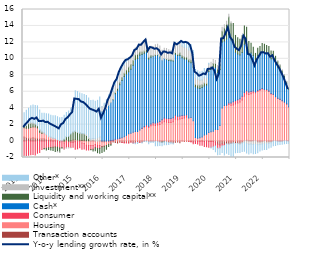
| Category | Transaction accounts | Housing | Consumer | Cash* | Liquidity and working capital** | Investment** | Other* |
|---|---|---|---|---|---|---|---|
| 2013-01-01 | 0.492 | 1.111 | -1.776 | 0 | 0.228 | -0.026 | 1.61 |
| 2013-02-01 | 0.439 | 1.127 | -1.758 | 0 | 0.325 | 0.055 | 1.802 |
| 2013-03-01 | 0.384 | 1.163 | -1.741 | 0 | 0.545 | 0.165 | 1.739 |
| 2013-04-01 | 0.352 | 1.289 | -1.665 | 0 | 0.493 | 0.147 | 1.999 |
| 2013-05-01 | 0.415 | 1.308 | -1.636 | 0 | 0.394 | 0.108 | 2.173 |
| 2013-06-01 | 0.343 | 1.366 | -1.699 | 0 | 0.33 | 0.062 | 2.234 |
| 2013-07-01 | 0.366 | 1.236 | -1.48 | 0 | 0.258 | 0.044 | 2.377 |
| 2013-08-01 | 0.269 | 0.793 | -1.401 | 0 | 0.249 | 0.096 | 2.37 |
| 2013-09-01 | 0.275 | 0.649 | -1.02 | 0 | 0.155 | 0.104 | 2.206 |
| 2013-10-01 | 0.288 | 0.658 | -0.915 | 0 | -0.041 | 0.071 | 2.362 |
| 2013-11-01 | 0.228 | 0.543 | -0.865 | 0 | -0.219 | 0.056 | 2.504 |
| 2013-12-01 | 0.173 | 0.348 | -0.812 | 0 | -0.202 | 0.099 | 2.679 |
| 2014-01-01 | 0.157 | 0.254 | -0.797 | 0 | -0.28 | 0.097 | 2.635 |
| 2014-02-01 | 0.046 | 0.245 | -0.762 | 0 | -0.373 | 0.085 | 2.693 |
| 2014-03-01 | 0.09 | 0.216 | -0.715 | 0 | -0.554 | 0.005 | 2.756 |
| 2014-04-01 | 0.083 | 0.103 | -0.741 | 0 | -0.539 | -0.021 | 2.769 |
| 2014-05-01 | -0.101 | 0.074 | -0.749 | 0 | -0.489 | -0.025 | 2.775 |
| 2014-06-01 | 0.019 | -0.042 | -0.742 | 0 | -0.097 | -0.013 | 2.845 |
| 2014-07-01 | -0.097 | -0.133 | -0.742 | 0 | 0.233 | -0.038 | 2.909 |
| 2014-08-01 | -0.096 | 0.125 | -0.721 | 0 | 0.406 | -0.038 | 2.94 |
| 2014-09-01 | -0.079 | 0.01 | -0.703 | 0 | 0.582 | -0.06 | 3.072 |
| 2014-10-01 | -0.145 | 0.049 | -0.645 | 0 | 0.801 | -0.027 | 3.138 |
| 2014-11-01 | -0.136 | 0.135 | -0.613 | 0 | 0.927 | 0.032 | 3.103 |
| 2014-12-01 | -0.093 | 0.165 | -0.899 | 0 | 1.027 | 0.018 | 4.9 |
| 2015-01-01 | -0.101 | 0.127 | -0.85 | 0 | 0.953 | 0.027 | 4.917 |
| 2015-02-01 | 0.048 | 0.049 | -0.809 | 0 | 0.87 | 0.009 | 4.873 |
| 2015-03-01 | 0.077 | -0.228 | -0.764 | 0 | 0.805 | 0.041 | 4.823 |
| 2015-04-01 | 0.094 | -0.3 | -0.676 | 0 | 0.722 | 0.107 | 4.729 |
| 2015-05-01 | 0.036 | -0.497 | -0.601 | 0 | 0.653 | 0.15 | 4.713 |
| 2015-06-01 | 0.047 | -0.529 | -0.544 | 0 | 0.27 | 0.209 | 4.71 |
| 2015-07-01 | 0.01 | -0.526 | -0.494 | 0 | -0.027 | 0.249 | 4.661 |
| 2015-08-01 | 0.058 | -0.546 | -0.455 | 0 | -0.197 | 0.245 | 4.67 |
| 2015-09-01 | -0.026 | -0.398 | -0.4 | 0 | -0.348 | 0.31 | 4.533 |
| 2015-10-01 | -0.033 | -0.489 | -0.371 | 0 | -0.523 | 0.396 | 4.552 |
| 2015-11-01 | 0.007 | -0.534 | -0.343 | 0 | -0.612 | 0.475 | 4.866 |
| 2015-12-01 | -0.087 | -0.586 | -0.019 | 3.553 | -0.71 | 0.612 | 0.012 |
| 2016-01-01 | -0.124 | -0.493 | -0.015 | 3.681 | -0.603 | 0.661 | 0.247 |
| 2016-02-01 | -0.042 | -0.508 | 0.006 | 3.928 | -0.452 | 0.725 | 0.36 |
| 2016-03-01 | -0.149 | -0.229 | 0.045 | 4.286 | -0.298 | 0.871 | 0.42 |
| 2016-04-01 | -0.285 | -0.1 | 0.053 | 4.618 | -0.122 | 0.89 | 0.421 |
| 2016-05-01 | -0.106 | 0.028 | 0.062 | 4.946 | 0.026 | 0.927 | 0.414 |
| 2016-06-01 | -0.172 | 0.16 | 0.059 | 5.547 | 0.131 | 0.935 | 0.426 |
| 2016-07-01 | -0.251 | 0.241 | 0.034 | 5.91 | 0.23 | 0.921 | 0.395 |
| 2016-08-01 | -0.151 | 0.345 | 0.008 | 6.5 | 0.297 | 0.931 | 0.417 |
| 2016-09-01 | -0.175 | 0.406 | -0.015 | 6.972 | 0.338 | 1.003 | 0.388 |
| 2016-10-01 | -0.173 | 0.538 | -0.05 | 7.327 | 0.384 | 0.98 | 0.406 |
| 2016-11-01 | -0.171 | 0.696 | -0.06 | 7.474 | 0.486 | 0.944 | 0.426 |
| 2016-12-01 | -0.197 | 0.873 | -0.04 | 7.552 | 0.582 | 0.863 | 0.252 |
| 2017-01-01 | -0.104 | 0.959 | -0.02 | 7.784 | 0.581 | 0.848 | 0.045 |
| 2017-02-01 | -0.204 | 1.081 | -0.026 | 8.139 | 0.571 | 0.839 | -0.036 |
| 2017-03-01 | -0.204 | 1.159 | -0.038 | 8.749 | 0.574 | 0.871 | -0.092 |
| 2017-04-01 | -0.15 | 1.157 | -0.034 | 8.89 | 0.496 | 0.901 | -0.106 |
| 2017-05-01 | -0.136 | 1.349 | -0.007 | 9.092 | 0.39 | 0.953 | 0.027 |
| 2017-06-01 | -0.147 | 1.539 | 0.027 | 8.949 | 0.32 | 1.052 | -0.078 |
| 2017-07-01 | -0.013 | 1.668 | 0.095 | 8.902 | 0.277 | 1.122 | -0.053 |
| 2017-08-01 | -0.025 | 1.767 | 0.186 | 8.894 | 0.31 | 1.206 | -0.055 |
| 2017-09-01 | -0.094 | 1.647 | 0.143 | 8.192 | 0.201 | 1.092 | -0.235 |
| 2017-10-01 | -0.014 | 1.85 | 0.235 | 8.093 | 0.233 | 1.132 | -0.151 |
| 2017-11-01 | -0.023 | 1.939 | 0.299 | 8.08 | 0.04 | 1.128 | -0.15 |
| 2017-12-01 | -0.055 | 1.895 | 0.307 | 8.215 | 0.084 | 1.227 | -0.507 |
| 2018-01-01 | -0.08 | 1.954 | 0.323 | 8.187 | 0.077 | 1.244 | -0.481 |
| 2018-02-01 | -0.112 | 2.022 | 0.364 | 7.858 | 0.041 | 1.267 | -0.424 |
| 2018-03-01 | -0.109 | 2.181 | 0.41 | 7.241 | -0.039 | 1.218 | -0.434 |
| 2018-04-01 | -0.08 | 2.337 | 0.457 | 7.237 | -0.009 | 1.25 | -0.36 |
| 2018-05-01 | -0.114 | 2.292 | 0.485 | 7.16 | 0.07 | 1.248 | -0.331 |
| 2018-06-01 | -0.164 | 2.242 | 0.499 | 7.054 | 0.135 | 1.17 | -0.265 |
| 2018-07-01 | -0.143 | 2.256 | 0.489 | 7.02 | 0.116 | 1.173 | -0.183 |
| 2018-08-01 | -0.223 | 2.357 | 0.468 | 6.916 | 0.085 | 1.152 | -0.143 |
| 2018-09-01 | -0.139 | 2.658 | 0.492 | 7.41 | 0.196 | 1.199 | 0.065 |
| 2018-10-01 | -0.124 | 2.593 | 0.436 | 7.379 | 0.15 | 1.167 | 0.099 |
| 2018-11-01 | -0.204 | 2.68 | 0.38 | 7.342 | 0.298 | 1.219 | 0.158 |
| 2018-12-01 | -0.005 | 2.736 | 0.362 | 7.027 | 0.25 | 1.199 | 0.551 |
| 2019-01-01 | -0.044 | 2.807 | 0.339 | 6.833 | 0.26 | 1.161 | 0.586 |
| 2019-02-01 | -0.024 | 2.911 | 0.28 | 6.76 | 0.267 | 1.154 | 0.65 |
| 2019-03-01 | -0.041 | 2.81 | -0.018 | 6.848 | 0.276 | 1.125 | 0.899 |
| 2019-04-01 | -0.041 | 2.851 | -0.072 | 6.67 | 0.344 | 0.939 | 0.934 |
| 2019-05-01 | -0.1 | 2.468 | -0.228 | 6.479 | 0.327 | 0.833 | 0.908 |
| 2019-06-01 | -0.031 | 0.418 | -0.277 | 6.176 | 0.319 | 0.797 | 0.985 |
| 2019-07-01 | -0.025 | 0.329 | -0.339 | 6.12 | 0.361 | 0.703 | 1.051 |
| 2019-08-01 | -0.025 | 0.403 | -0.498 | 5.998 | 0.374 | 0.626 | 1.011 |
| 2019-09-01 | 0.002 | 0.505 | -0.508 | 6.006 | 0.326 | 0.599 | 1.06 |
| 2019-10-01 | -0.05 | 0.732 | -0.599 | 5.959 | 0.37 | 0.626 | 1.125 |
| 2019-11-01 | 0.007 | 0.833 | -0.705 | 5.97 | 0.215 | 0.673 | 1.082 |
| 2019-12-01 | -0.045 | 1.054 | -0.703 | 7.412 | 0.299 | 0.593 | 0.108 |
| 2020-01-31 | -0.066 | 1.137 | -0.68 | 7.552 | 0.352 | 0.533 | -0.107 |
| 2020-02-29 | -0.05 | 1.19 | -0.645 | 7.832 | 0.424 | 0.471 | -0.342 |
| 2020-03-31 | -0.142 | 1.412 | -0.468 | 7.55 | 0.49 | 0.355 | -0.69 |
| 2020-04-30 | -0.389 | 1.394 | -0.481 | 6.938 | 0.422 | 0.421 | -0.803 |
| 2020-05-31 | -0.495 | 1.906 | -0.315 | 6.799 | 0.629 | 0.444 | -0.833 |
| 2020-06-30 | -0.37 | 4.031 | -0.214 | 8.026 | 1.3 | 0.469 | -0.818 |
| 2020-07-31 | -0.414 | 4.316 | -0.138 | 7.868 | 1.575 | 0.386 | -1.15 |
| 2020-08-31 | -0.351 | 4.33 | 0.051 | 8.037 | 1.786 | 0.363 | -1.144 |
| 2020-09-30 | -0.365 | 4.448 | 0.173 | 8.326 | 2.142 | 0.325 | -1.281 |
| 2020-10-31 | -0.294 | 4.368 | 0.267 | 7.647 | 2.039 | 0.188 | -1.635 |
| 2020-11-30 | -0.236 | 4.392 | 0.386 | 7.401 | 2.127 | -0.011 | -1.82 |
| 2020-12-31 | -0.302 | 4.507 | 0.414 | 5.891 | 2.034 | -0.043 | -1.082 |
| 2021-01-31 | -0.282 | 4.635 | 0.397 | 5.556 | 1.97 | -0.052 | -1.049 |
| 2021-02-28 | -0.276 | 4.761 | 0.394 | 5.304 | 1.925 | -0.108 | -0.997 |
| 2021-03-31 | -0.145 | 5.005 | 0.432 | 5.347 | 2.033 | -0.133 | -1.003 |
| 2021-04-30 | 0.02 | 5.429 | 0.452 | 5.88 | 2.211 | -0.185 | -1.049 |
| 2021-05-31 | 0.142 | 5.576 | 0.389 | 5.716 | 2.006 | -0.317 | -1.137 |
| 2021-06-30 | 0.036 | 5.628 | 0.3 | 4.693 | 1.452 | -0.375 | -1.203 |
| 2021-07-31 | 0.04 | 5.703 | 0.271 | 4.689 | 1.181 | -0.351 | -1.075 |
| 2021-08-31 | 0.059 | 5.81 | 0.205 | 4.34 | 0.98 | -0.415 | -1.12 |
| 2021-09-30 | 0 | 5.853 | 0.128 | 3.917 | 0.762 | -0.412 | -1.106 |
| 2021-10-31 | -0.107 | 6.042 | 0.11 | 4.261 | 0.87 | -0.332 | -0.987 |
| 2021-11-30 | -0.109 | 6.166 | 0.093 | 4.251 | 0.994 | -0.266 | -0.839 |
| 2021-12-31 | -0.087 | 6.322 | 0.08 | 4.403 | 1.047 | -0.273 | -0.742 |
| 2022-01-31 | -0.066 | 6.231 | 0.084 | 4.443 | 1.001 | -0.255 | -0.693 |
| 2022-02-28 | -0.124 | 6.188 | 0.071 | 4.378 | 0.993 | -0.225 | -0.687 |
| 2022-03-31 | -0.083 | 6.019 | 0.055 | 4.389 | 1.023 | -0.188 | -0.585 |
| 2022-04-30 | -0.061 | 5.737 | 0.032 | 4.238 | 0.934 | -0.139 | -0.549 |
| 2022-05-31 | 0.017 | 5.644 | 0.02 | 4.3 | 0.95 | -0.069 | -0.489 |
| 2022-06-30 | 0.008 | 5.383 | 0.015 | 4.074 | 0.832 | -0.056 | -0.481 |
| 2022-07-31 | -0.011 | 5.185 | 0.011 | 3.782 | 0.741 | 0.009 | -0.429 |
| 2022-08-31 | -0.029 | 5.065 | 0.012 | 3.513 | 0.637 | 0.065 | -0.393 |
| 2022-09-30 | -0.009 | 4.898 | 0.018 | 3.181 | 0.488 | 0.078 | -0.369 |
| 2022-10-31 | 0.065 | 4.653 | 0.028 | 2.867 | 0.387 | 0.039 | -0.323 |
| 2022-11-30 | 0.074 | 4.406 | 0.043 | 2.439 | 0.259 | 0.049 | -0.305 |
| 2022-12-31 | 0.034 | 4.091 | 0.046 | 2.1 | 0.164 | 0.136 | -0.311 |